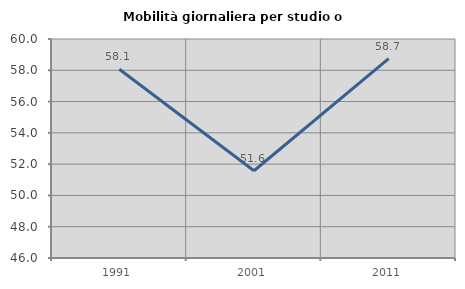
| Category | Mobilità giornaliera per studio o lavoro |
|---|---|
| 1991.0 | 58.065 |
| 2001.0 | 51.577 |
| 2011.0 | 58.748 |